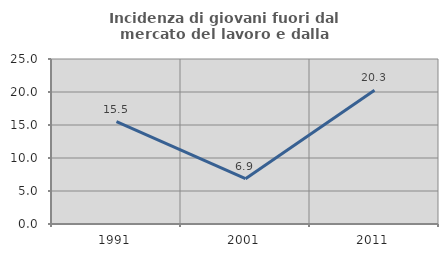
| Category | Incidenza di giovani fuori dal mercato del lavoro e dalla formazione  |
|---|---|
| 1991.0 | 15.517 |
| 2001.0 | 6.857 |
| 2011.0 | 20.27 |